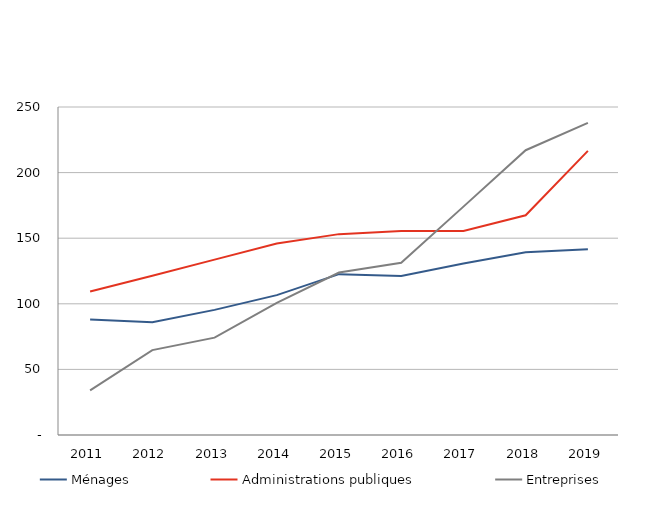
| Category | Ménages | Administrations publiques | Entreprises |
|---|---|---|---|
| 2011.0 | 88.056 | 109.393 | 33.962 |
| 2012.0 | 86.03 | 121.362 | 64.687 |
| 2013.0 | 95.358 | 133.652 | 74.215 |
| 2014.0 | 106.587 | 146.023 | 100.684 |
| 2015.0 | 122.589 | 153.105 | 123.826 |
| 2016.0 | 121.245 | 155.471 | 131.232 |
| 2017.0 | 130.781 | 155.539 | 174.061 |
| 2018.0 | 139.263 | 167.456 | 217.058 |
| 2019.0 | 141.529 | 216.582 | 237.956 |